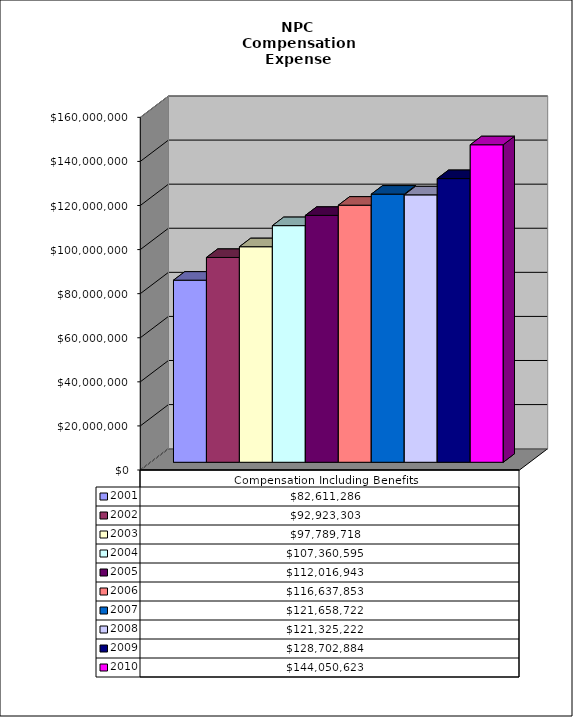
| Category | 2001 | 2002 | 2003 | 2004 | 2005 | 2006 | 2007 | 2008 | 2009 | 2010 |
|---|---|---|---|---|---|---|---|---|---|---|
| Compensation Including Benefits | 82611286 | 92923303 | 97789718 | 107360595 | 112016943 | 116637853 | 121658722 | 121325222 | 128702884 | 144050623 |